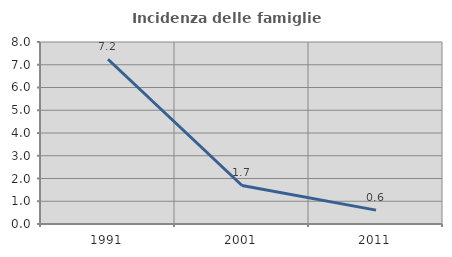
| Category | Incidenza delle famiglie numerose |
|---|---|
| 1991.0 | 7.24 |
| 2001.0 | 1.693 |
| 2011.0 | 0.61 |